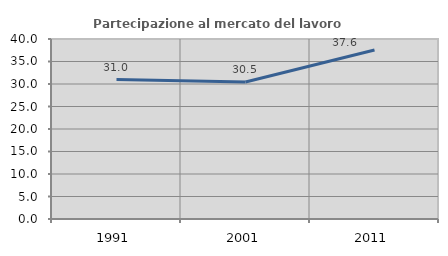
| Category | Partecipazione al mercato del lavoro  femminile |
|---|---|
| 1991.0 | 30.994 |
| 2001.0 | 30.451 |
| 2011.0 | 37.572 |